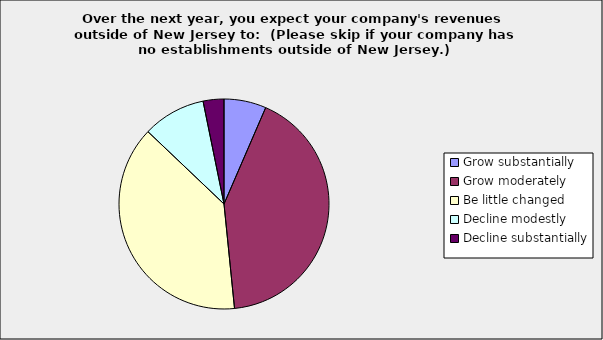
| Category | Series 0 |
|---|---|
| Grow substantially | 0.065 |
| Grow moderately | 0.419 |
| Be little changed | 0.387 |
| Decline modestly | 0.097 |
| Decline substantially | 0.032 |